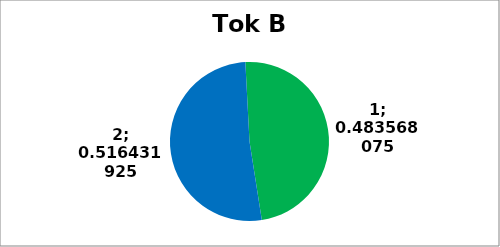
| Category | Series 0 |
|---|---|
| 0 | 103 |
| 1 | 110 |